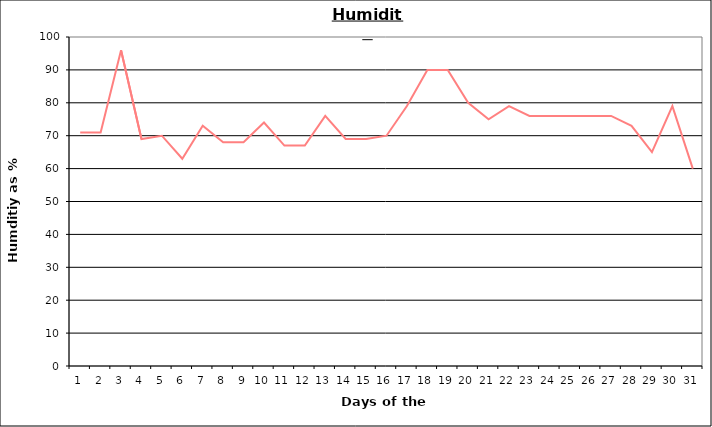
| Category | Series 0 |
|---|---|
| 0 | 71 |
| 1 | 71 |
| 2 | 96 |
| 3 | 69 |
| 4 | 70 |
| 5 | 63 |
| 6 | 73 |
| 7 | 68 |
| 8 | 68 |
| 9 | 74 |
| 10 | 67 |
| 11 | 67 |
| 12 | 76 |
| 13 | 69 |
| 14 | 69 |
| 15 | 70 |
| 16 | 79 |
| 17 | 90 |
| 18 | 90 |
| 19 | 80 |
| 20 | 75 |
| 21 | 79 |
| 22 | 76 |
| 23 | 76 |
| 24 | 76 |
| 25 | 76 |
| 26 | 76 |
| 27 | 73 |
| 28 | 65 |
| 29 | 79 |
| 30 | 60 |